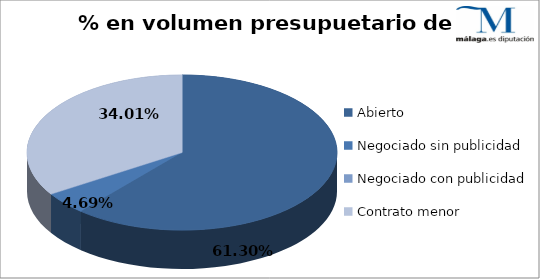
| Category | Series 0 |
|---|---|
| Abierto | 0.613 |
| Negociado sin publicidad | 0.047 |
| Negociado con publicidad | 0 |
| Contrato menor | 0.34 |